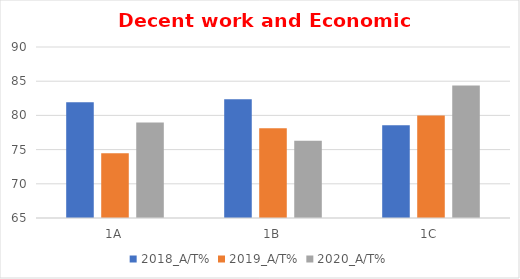
| Category | 2018_A/T% | 2019_A/T% | 2020_A/T% |
|---|---|---|---|
| 1A | 81.928 | 74.468 | 78.947 |
| 1B | 82.353 | 78.125 | 76.289 |
| 1C | 78.571 | 80 | 84.375 |